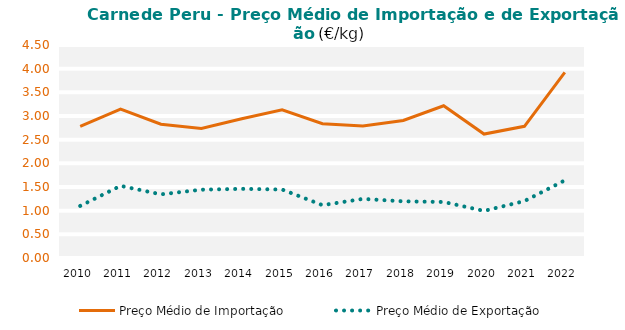
| Category | Preço Médio de Importação | Preço Médio de Exportação |
|---|---|---|
| 2010.0 | 2.779 | 1.101 |
| 2011.0 | 3.146 | 1.524 |
| 2012.0 | 2.826 | 1.345 |
| 2013.0 | 2.738 | 1.443 |
| 2014.0 | 2.94 | 1.461 |
| 2015.0 | 3.132 | 1.447 |
| 2016.0 | 2.836 | 1.116 |
| 2017.0 | 2.79 | 1.249 |
| 2018.0 | 2.907 | 1.197 |
| 2019.0 | 3.216 | 1.183 |
| 2020.0 | 2.618 | 0.995 |
| 2021.0 | 2.783 | 1.203 |
| 2022.0 | 3.922 | 1.64 |